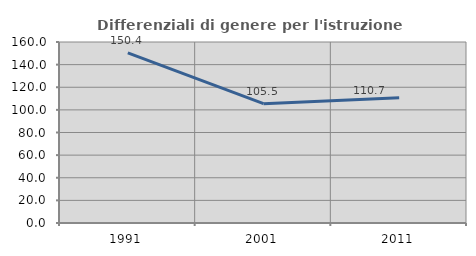
| Category | Differenziali di genere per l'istruzione superiore |
|---|---|
| 1991.0 | 150.374 |
| 2001.0 | 105.491 |
| 2011.0 | 110.702 |